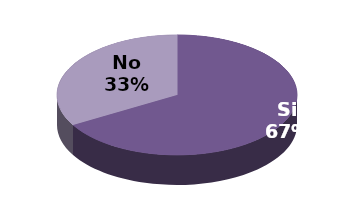
| Category | Series 1 |
|---|---|
| Si | 6 |
| No | 3 |